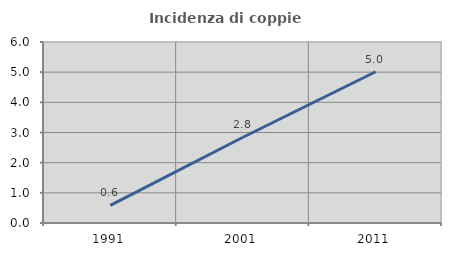
| Category | Incidenza di coppie miste |
|---|---|
| 1991.0 | 0.585 |
| 2001.0 | 2.842 |
| 2011.0 | 5.013 |